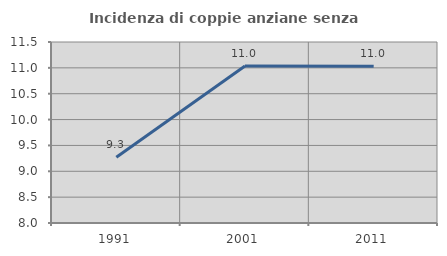
| Category | Incidenza di coppie anziane senza figli  |
|---|---|
| 1991.0 | 9.272 |
| 2001.0 | 11.034 |
| 2011.0 | 11.029 |